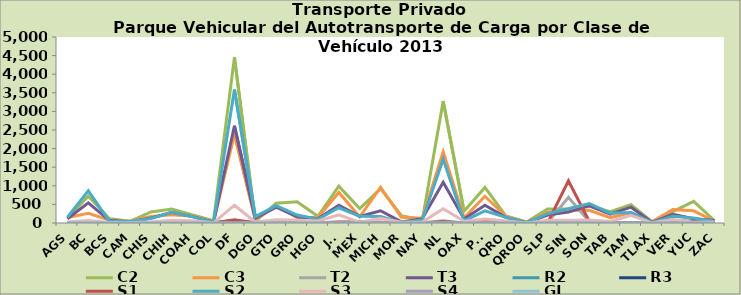
| Category | C2 | C3 | T2 | T3 | R2 | R3 | S1 | S2 | S3 | S4 | GI |
|---|---|---|---|---|---|---|---|---|---|---|---|
| AGS | 131 | 144 | 3 | 114 | 4 | 0 | 3 | 155 | 29 | 0 | 0 |
| BC | 721 | 260 | 32 | 543 | 12 | 0 | 23 | 864 | 66 | 3 | 0 |
| BCS | 122 | 78 | 1 | 73 | 1 | 6 | 0 | 51 | 15 | 0 | 0 |
| CAM | 43 | 49 | 4 | 28 | 0 | 0 | 0 | 44 | 11 | 0 | 0 |
| CHIS | 298 | 176 | 5 | 132 | 5 | 0 | 11 | 121 | 24 | 0 | 0 |
| CHIH | 375 | 223 | 9 | 285 | 3 | 1 | 9 | 286 | 74 | 1 | 0 |
| COAH | 219 | 179 | 14 | 172 | 2 | 1 | 6 | 166 | 60 | 0 | 0 |
| COL | 62 | 26 | 4 | 21 | 5 | 1 | 3 | 18 | 4 | 0 | 0 |
| DF | 4457 | 2386 | 70 | 2615 | 69 | 11 | 84 | 3589 | 478 | 2 | 2 |
| DGO | 46 | 87 | 16 | 129 | 1 | 0 | 1 | 172 | 26 | 0 | 0 |
| GTO | 529 | 470 | 17 | 424 | 2 | 0 | 18 | 468 | 85 | 1 | 3 |
| GRO | 568 | 147 | 0 | 166 | 3 | 1 | 0 | 215 | 71 | 0 | 0 |
| HGO | 180 | 151 | 1 | 114 | 0 | 0 | 4 | 100 | 53 | 0 | 0 |
| JAL | 990 | 822 | 20 | 477 | 3 | 13 | 28 | 410 | 218 | 1 | 0 |
| MEX | 388 | 166 | 32 | 177 | 11 | 0 | 21 | 180 | 24 | 0 | 3 |
| MICH | 922 | 957 | 20 | 328 | 9 | 4 | 21 | 178 | 126 | 0 | 0 |
| MOR | 194 | 155 | 3 | 30 | 0 | 1 | 0 | 13 | 19 | 0 | 0 |
| NAY | 83 | 130 | 0 | 117 | 0 | 0 | 5 | 84 | 25 | 0 | 0 |
| NL | 3276 | 1915 | 59 | 1093 | 18 | 12 | 34 | 1714 | 385 | 2 | 0 |
| OAX | 318 | 139 | 2 | 108 | 0 | 3 | 0 | 57 | 47 | 0 | 0 |
| PUE | 955 | 719 | 28 | 477 | 9 | 5 | 58 | 325 | 105 | 0 | 0 |
| QRO | 190 | 181 | 9 | 152 | 2 | 0 | 31 | 155 | 52 | 0 | 1 |
| QROO | 28 | 6 | 2 | 8 | 1 | 0 | 0 | 4 | 1 | 0 | 0 |
| SLP | 376 | 293 | 9 | 213 | 7 | 4 | 3 | 251 | 73 | 0 | 0 |
| SIN | 384 | 348 | 689 | 292 | 1 | 0 | 1132 | 385 | 71 | 0 | 2 |
| SON | 464 | 342 | 37 | 460 | 5 | 0 | 40 | 524 | 80 | 1 | 0 |
| TAB | 304 | 146 | 4 | 239 | 1 | 5 | 17 | 264 | 41 | 0 | 0 |
| TAM | 490 | 273 | 10 | 425 | 5 | 3 | 8 | 281 | 205 | 2 | 0 |
| TLAX | 38 | 30 | 0 | 19 | 5 | 0 | 0 | 8 | 4 | 0 | 0 |
| VER | 308 | 359 | 21 | 234 | 2 | 2 | 77 | 179 | 93 | 0 | 0 |
| YUC | 581 | 328 | 26 | 116 | 1 | 0 | 43 | 134 | 21 | 0 | 2 |
| ZAC | 61 | 47 | 1 | 65 | 0 | 0 | 0 | 42 | 30 | 0 | 0 |